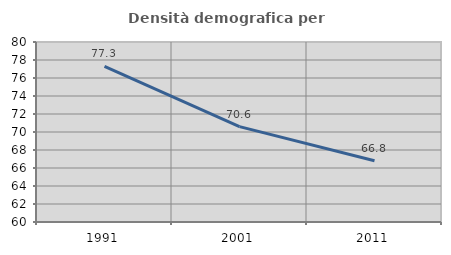
| Category | Densità demografica |
|---|---|
| 1991.0 | 77.295 |
| 2001.0 | 70.595 |
| 2011.0 | 66.802 |